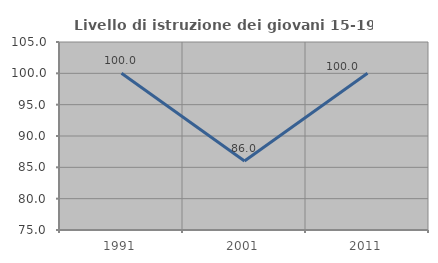
| Category | Livello di istruzione dei giovani 15-19 anni |
|---|---|
| 1991.0 | 100 |
| 2001.0 | 86 |
| 2011.0 | 100 |